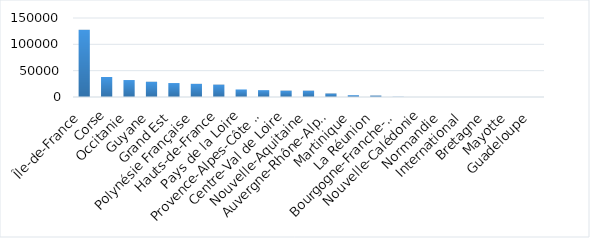
| Category | Île-de-France |
|---|---|
| Île-de-France | 127609.7 |
| Corse | 37995.82 |
| Occitanie | 32200 |
| Guyane | 28950 |
| Grand Est | 26491 |
| Polynésie Française | 25000 |
| Hauts-de-France | 23450 |
| Pays de la Loire | 14300 |
| Provence-Alpes-Côte d'Azur | 12995 |
| Centre-Val de Loire | 12059.65 |
| Nouvelle-Aquitaine | 12015 |
| Auvergne-Rhône-Alpes | 6615 |
| Martinique | 3401 |
| La Réunion | 2700 |
| Bourgogne-Franche-Comté | 400 |
| Nouvelle-Calédonie | 0 |
| Normandie | 0 |
| International | 0 |
| Bretagne | 0 |
| Mayotte | 0 |
| Guadeloupe | 0 |